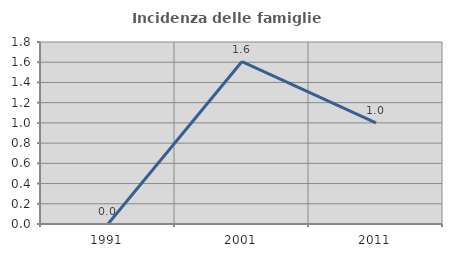
| Category | Incidenza delle famiglie numerose |
|---|---|
| 1991.0 | 0 |
| 2001.0 | 1.606 |
| 2011.0 | 1 |